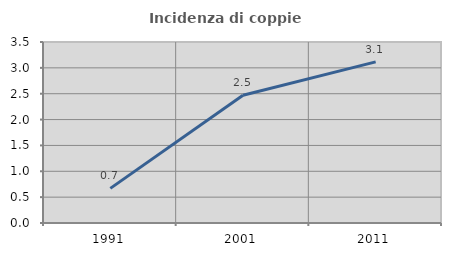
| Category | Incidenza di coppie miste |
|---|---|
| 1991.0 | 0.669 |
| 2001.0 | 2.471 |
| 2011.0 | 3.115 |